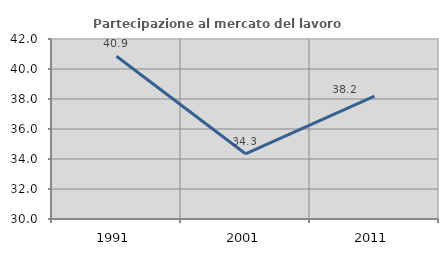
| Category | Partecipazione al mercato del lavoro  femminile |
|---|---|
| 1991.0 | 40.851 |
| 2001.0 | 34.348 |
| 2011.0 | 38.197 |